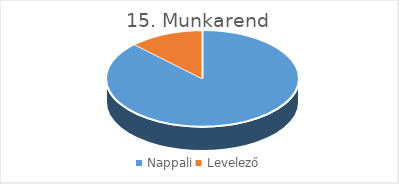
| Category | Series 0 |
|---|---|
| Nappali | 0.875 |
| Levelező | 0.125 |